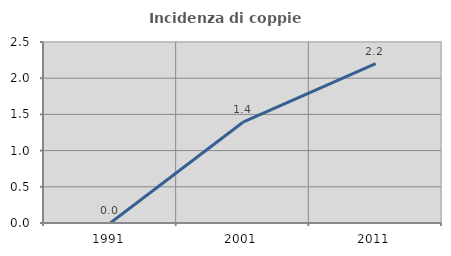
| Category | Incidenza di coppie miste |
|---|---|
| 1991.0 | 0 |
| 2001.0 | 1.392 |
| 2011.0 | 2.2 |